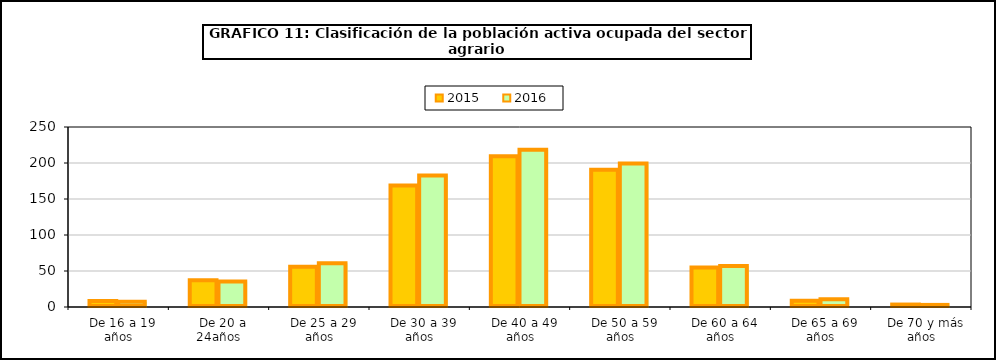
| Category | 2015 | 2016 |
|---|---|---|
|   De 16 a 19 años | 8.4 | 7.3 |
|   De 20 a 24años | 37.275 | 35.5 |
|   De 25 a 29 años | 56.025 | 60.9 |
|   De 30 a 39 años | 168.65 | 182.7 |
|   De 40 a 49 años | 209.275 | 218.5 |
|   De 50 a 59 años | 190.475 | 199.3 |
|   De 60 a 64 años | 54.725 | 56.8 |
|   De 65 a 69 años | 8.6 | 10.8 |
|   De 70 y más años | 3.4 | 2.9 |